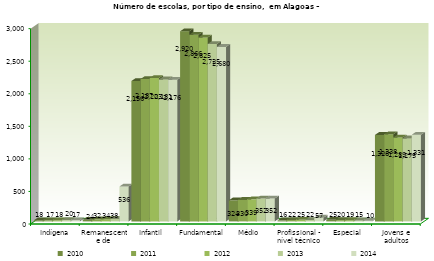
| Category | 2010 | 2011 | 2012 | 2013 | 2014 |
|---|---|---|---|---|---|
| Indígena | 18 | 17 | 18 | 20 | 17 |
| Remanescente de Quilombos | 24 | 32 | 34 | 38 | 536 |
| Infantil  | 2156 | 2187 | 2203 | 2181 | 2176 |
| Fundamental | 2920 | 2866 | 2825 | 2725 | 2680 |
| Médio | 324 | 330 | 339 | 352 | 352 |
| Profissional - nível técnico | 16 | 22 | 25 | 22 | 57 |
| Especial | 25 | 20 | 19 | 15 | 10 |
| Jovens e adultos | 1328 | 1338 | 1289 | 1275 | 1331 |